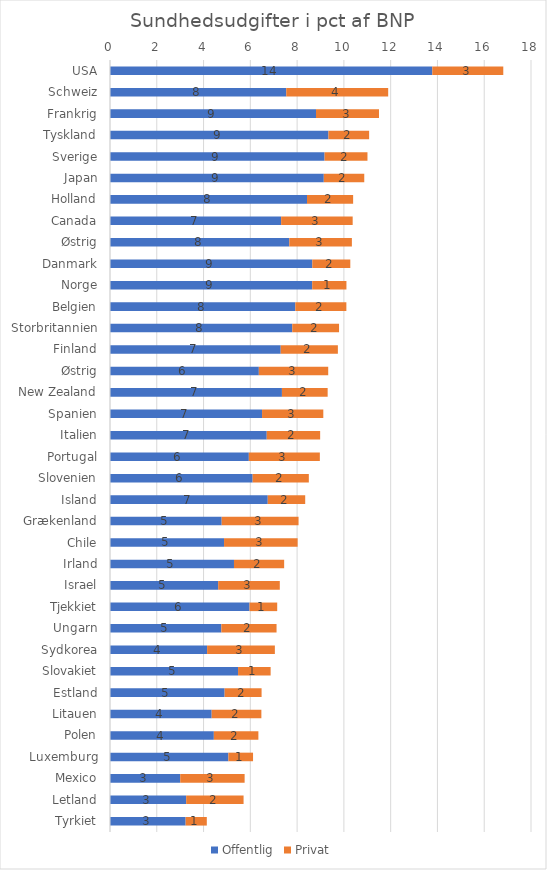
| Category | Offentlig | Privat |
|---|---|---|
| USA | 13.78 | 3.035 |
| Schweiz | 7.536 | 4.358 |
| Frankrig | 8.808 | 2.693 |
| Tyskland | 9.339 | 1.74 |
| Sverige | 9.174 | 1.834 |
| Japan | 9.141 | 1.73 |
| Holland | 8.423 | 1.972 |
| Canada | 7.317 | 3.059 |
| Østrig | 7.666 | 2.676 |
| Danmark | 8.649 | 1.625 |
| Norge | 8.645 | 1.464 |
| Belgien | 7.923 | 2.183 |
| Storbritannien | 7.793 | 2 |
| Finland | 7.299 | 2.444 |
| Østrig | 6.364 | 2.966 |
| New Zealand | 7.351 | 1.955 |
| Spanien | 6.501 | 2.619 |
| Italien | 6.702 | 2.283 |
| Portugal | 5.936 | 3.036 |
| Slovenien | 6.099 | 2.402 |
| Island | 6.745 | 1.601 |
| Grækenland | 4.776 | 3.286 |
| Chile | 4.876 | 3.146 |
| Irland | 5.301 | 2.145 |
| Israel | 4.625 | 2.635 |
| Tjekkiet | 5.966 | 1.183 |
| Ungarn | 4.761 | 2.36 |
| Sydkorea | 4.152 | 2.897 |
| Slovakiet | 5.475 | 1.393 |
| Estland | 4.901 | 1.58 |
| Litauen | 4.348 | 2.124 |
| Polen | 4.44 | 1.904 |
| Luxemburg | 5.061 | 1.055 |
| Mexico | 3.003 | 2.753 |
| Letland | 3.257 | 2.454 |
| Tyrkiet | 3.234 | 0.905 |